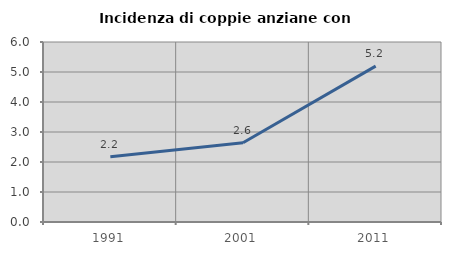
| Category | Incidenza di coppie anziane con figli |
|---|---|
| 1991.0 | 2.174 |
| 2001.0 | 2.643 |
| 2011.0 | 5.195 |